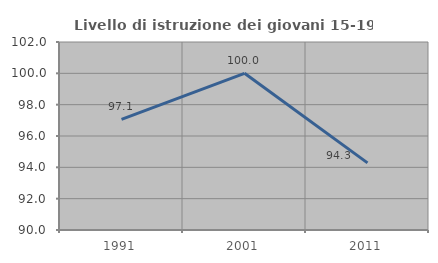
| Category | Livello di istruzione dei giovani 15-19 anni |
|---|---|
| 1991.0 | 97.059 |
| 2001.0 | 100 |
| 2011.0 | 94.286 |